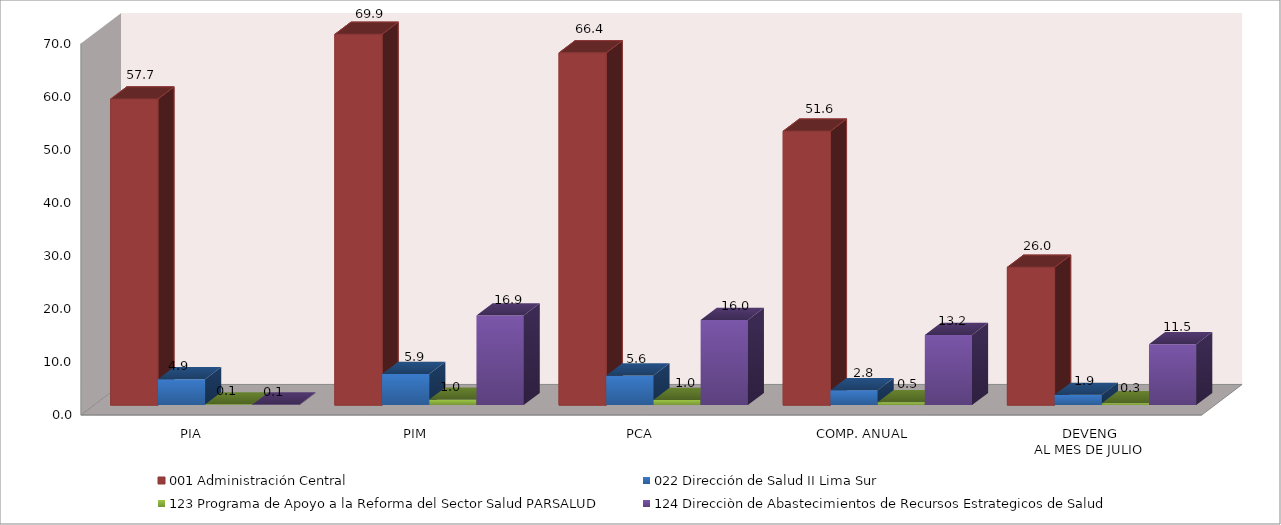
| Category | 001 Administración Central | 022 Dirección de Salud II Lima Sur | 123 Programa de Apoyo a la Reforma del Sector Salud PARSALUD | 124 Direcciòn de Abastecimientos de Recursos Estrategicos de Salud |
|---|---|---|---|---|
| PIA | 57.681 | 4.868 | 0.136 | 0.1 |
| PIM | 69.88 | 5.868 | 1.036 | 16.889 |
| PCA | 66.386 | 5.575 | 0.984 | 16.044 |
| COMP. ANUAL | 51.626 | 2.791 | 0.546 | 13.217 |
| DEVENG
AL MES DE JULIO | 25.974 | 1.933 | 0.343 | 11.457 |